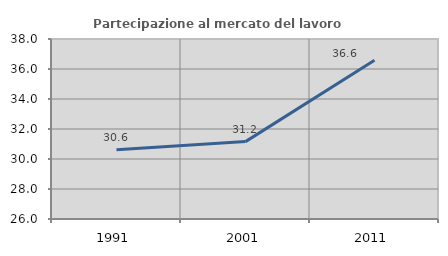
| Category | Partecipazione al mercato del lavoro  femminile |
|---|---|
| 1991.0 | 30.623 |
| 2001.0 | 31.159 |
| 2011.0 | 36.585 |